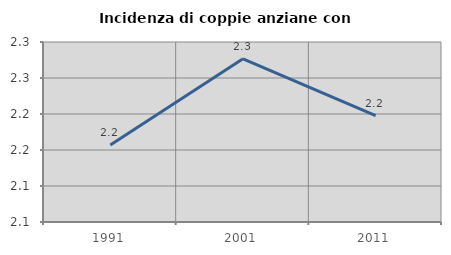
| Category | Incidenza di coppie anziane con figli |
|---|---|
| 1991.0 | 2.157 |
| 2001.0 | 2.277 |
| 2011.0 | 2.198 |